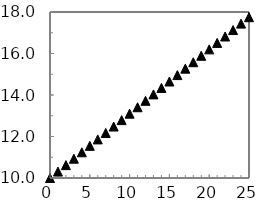
| Category | Series 2 |
|---|---|
| 0.0 | 10 |
| 1.0 | 10.31 |
| 2.0 | 10.62 |
| 3.0 | 10.93 |
| 4.0 | 11.24 |
| 5.0 | 11.55 |
| 6.0 | 11.86 |
| 7.0 | 12.17 |
| 8.0 | 12.48 |
| 9.0 | 12.79 |
| 10.0 | 13.1 |
| 11.0 | 13.41 |
| 12.0 | 13.72 |
| 13.0 | 14.03 |
| 14.0 | 14.34 |
| 15.0 | 14.65 |
| 16.0 | 14.96 |
| 17.0 | 15.27 |
| 18.0 | 15.58 |
| 19.0 | 15.89 |
| 20.0 | 16.2 |
| 21.0 | 16.51 |
| 22.0 | 16.82 |
| 23.0 | 17.13 |
| 24.0 | 17.44 |
| 25.0 | 17.75 |